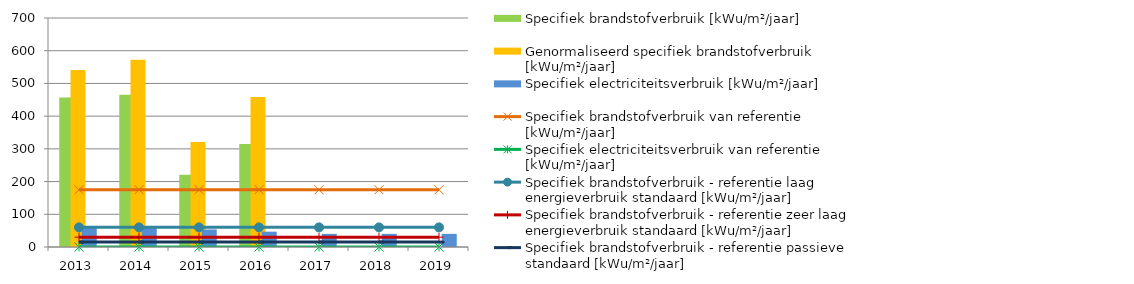
| Category | Specifiek brandstofverbruik [kWu/m²/jaar]
 | Genormaliseerd specifiek brandstofverbruik [kWu/m²/jaar]

 | Specifiek electriciteitsverbruik [kWu/m²/jaar]

 |
|---|---|---|---|
| 2013.0 | 456.875 | 541.11 | 60.22 |
| 2014.0 | 465.583 | 572.425 | 60.22 |
| 2015.0 | 220.506 | 321.24 | 53.529 |
| 2016.0 | 314.995 | 458.895 | 46.838 |
| 2017.0 | 0 | 0 | 40.146 |
| 2018.0 | 0 | 0 | 40.146 |
| 2019.0 | 0 | 0 | 40.146 |